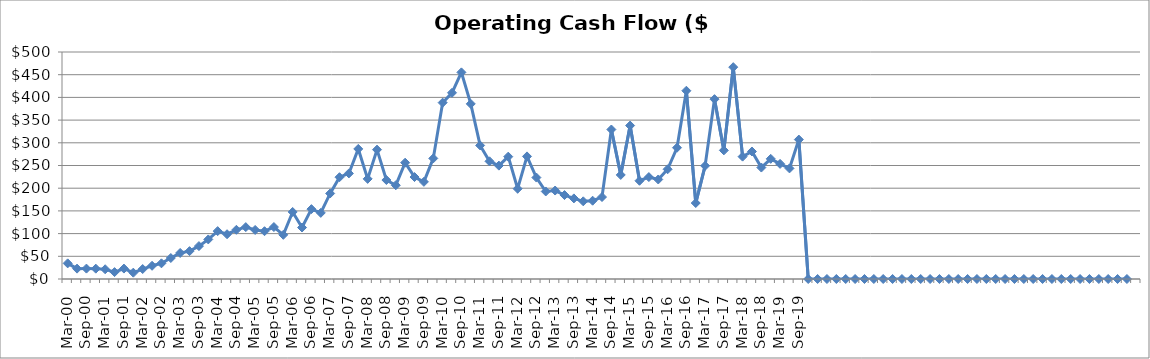
| Category | Operating Cash Flow ($Millions) |
|---|---|
| Mar-00 | 34.45 |
| Jun-00 | 22.83 |
| Sep-00 | 22.896 |
| Dec-00 | 22.77 |
| Mar-01 | 21.443 |
| Jun-01 | 15.185 |
| Sep-01 | 22.974 |
| Dec-01 | 13.913 |
| Mar-02 | 21.938 |
| Jun-02 | 29.114 |
| Sep-02 | 34.526 |
| Dec-02 | 46.202 |
| Mar-03 | 57.386 |
| Jun-03 | 61.378 |
| Sep-03 | 72.458 |
| Dec-03 | 87.154 |
| Mar-04 | 105.48 |
| Jun-04 | 98.622 |
| Sep-04 | 108.368 |
| Dec-04 | 114.265 |
| Mar-05 | 108.057 |
| Jun-05 | 105.267 |
| Sep-05 | 114.444 |
| Dec-05 | 97.321 |
| Mar-06 | 147.672 |
| Jun-06 | 113.382 |
| Sep-06 | 153.877 |
| Dec-06 | 145.629 |
| Mar-07 | 188.41 |
| Jun-07 | 224.19 |
| Sep-07 | 232.554 |
| Dec-07 | 286.504 |
| Mar-08 | 220.548 |
| Jun-08 | 284.869 |
| Sep-08 | 218 |
| Dec-08 | 206.504 |
| Mar-09 | 256.2 |
| Jun-09 | 224.573 |
| Sep-09 | 214 |
| Dec-09 | 265.6 |
| Mar-10 | 388.456 |
| Jun-10 | 410.189 |
| Sep-10 | 455.14 |
| Dec-10 | 385.752 |
| Mar-11 | 294.2 |
| Jun-11 | 259.252 |
| Sep-11 | 249.692 |
| Dec-11 | 269.479 |
| Mar-12 | 198.882 |
| Jun-12 | 270.062 |
| Sep-12 | 223.452 |
| Dec-12 | 192.775 |
| Mar-13 | 194.834 |
| Jun-13 | 184.896 |
| Sep-13 | 177.546 |
| Dec-13 | 171.085 |
| Mar-14 | 172.438 |
| Jun-14 | 180.568 |
| Sep-14 | 329.261 |
| Dec-14 | 229.212 |
| Mar-15 | 337.995 |
| Jun-15 | 216.389 |
| Sep-15 | 224.475 |
| Dec-15 | 219.179 |
| Mar-16 | 241.684 |
| Jun-16 | 289.13 |
| Sep-16 | 414.659 |
| Dec-16 | 167.363 |
| Mar-17 | 249.334 |
| Jun-17 | 396.148 |
| Sep-17 | 283.348 |
| Dec-17 | 466.615 |
| Mar-18 | 269.521 |
| Jun-18 | 280.843 |
| Sep-18 | 245.485 |
| Dec-18 | 264.678 |
| Mar-19 | 253.552 |
| Jun-19 | 243.6 |
| Sep-19 | 307.094 |